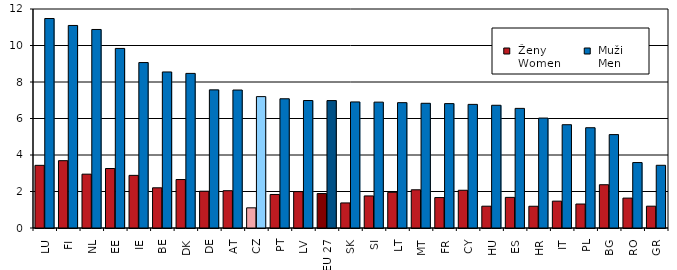
| Category |  Ženy 
 Women |  Muži 
 Men |
|---|---|---|
| LU | 3.434 | 11.478 |
| FI | 3.689 | 11.098 |
| NL | 2.95 | 10.878 |
| EE | 3.26 | 9.84 |
| IE | 2.884 | 9.065 |
| BE | 2.203 | 8.55 |
| DK | 2.655 | 8.471 |
| DE | 2.016 | 7.569 |
| AT | 2.044 | 7.561 |
| CZ | 1.105 | 7.199 |
| PT | 1.837 | 7.081 |
| LV | 1.992 | 6.985 |
| EU 27 | 1.888 | 6.981 |
| SK | 1.374 | 6.908 |
| SI | 1.757 | 6.897 |
| LT | 1.955 | 6.868 |
| MT | 2.094 | 6.833 |
| FR | 1.667 | 6.815 |
| CY | 2.068 | 6.773 |
| HU | 1.195 | 6.725 |
| ES | 1.677 | 6.554 |
| HR | 1.191 | 6.024 |
| IT | 1.472 | 5.66 |
| PL | 1.314 | 5.494 |
| BG | 2.371 | 5.118 |
| RO | 1.639 | 3.586 |
| GR | 1.195 | 3.436 |